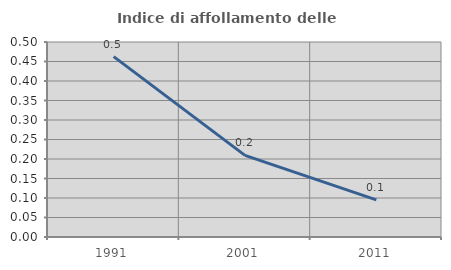
| Category | Indice di affollamento delle abitazioni  |
|---|---|
| 1991.0 | 0.462 |
| 2001.0 | 0.209 |
| 2011.0 | 0.095 |